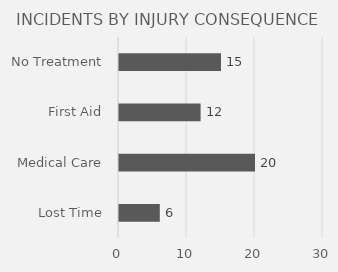
| Category | INCIDENTS BY INJURY CONSEQUENCE |
|---|---|
| Lost Time | 6 |
| Medical Care | 20 |
| First Aid | 12 |
| No Treatment | 15 |